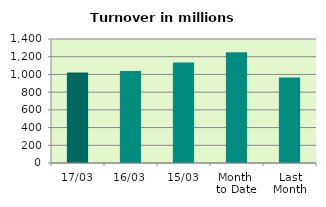
| Category | Series 0 |
|---|---|
| 17/03 | 1021.101 |
| 16/03 | 1039.704 |
| 15/03 | 1133.555 |
| Month 
to Date | 1249.037 |
| Last
Month | 966.674 |